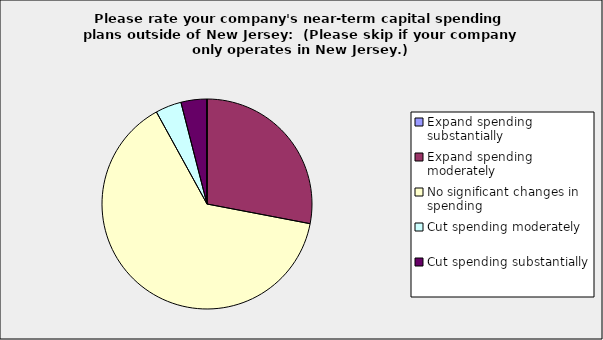
| Category | Series 0 |
|---|---|
| Expand spending substantially | 0 |
| Expand spending moderately | 0.28 |
| No significant changes in spending | 0.64 |
| Cut spending moderately | 0.04 |
| Cut spending substantially | 0.04 |